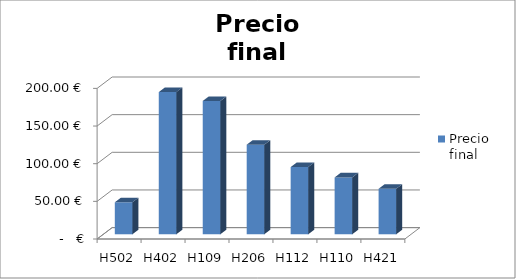
| Category | Precio
final |
|---|---|
| H502 | 42.48 |
| H402 | 188.8 |
| H109 | 177 |
| H206 | 118.944 |
| H112 | 89.208 |
| H110 | 75.52 |
| H421 | 60.416 |